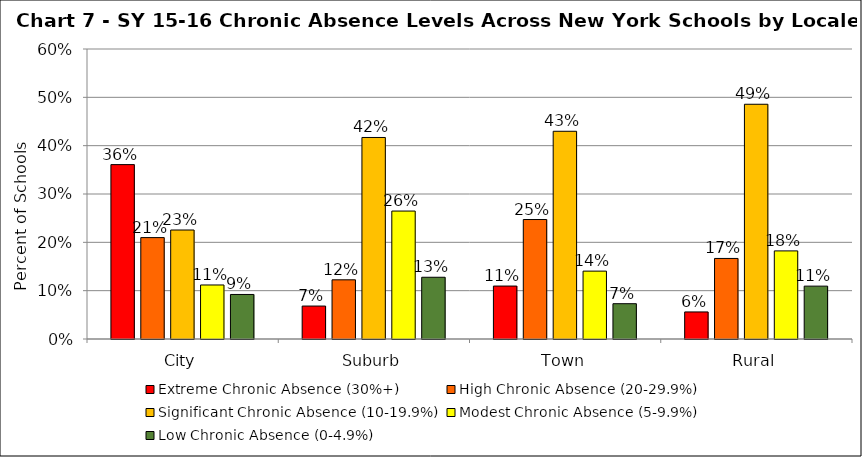
| Category | Extreme Chronic Absence (30%+) | High Chronic Absence (20-29.9%) | Significant Chronic Absence (10-19.9%) | Modest Chronic Absence (5-9.9%) | Low Chronic Absence (0-4.9%) |
|---|---|---|---|---|---|
| 0 | 0.361 | 0.21 | 0.225 | 0.112 | 0.092 |
| 1 | 0.068 | 0.122 | 0.417 | 0.265 | 0.128 |
| 2 | 0.11 | 0.247 | 0.43 | 0.14 | 0.073 |
| 3 | 0.056 | 0.167 | 0.486 | 0.182 | 0.109 |